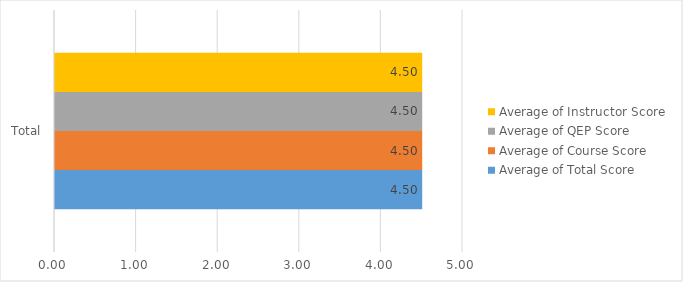
| Category | Average of Total Score | Average of Course Score | Average of QEP Score | Average of Instructor Score |
|---|---|---|---|---|
| Total | 4.5 | 4.5 | 4.5 | 4.5 |